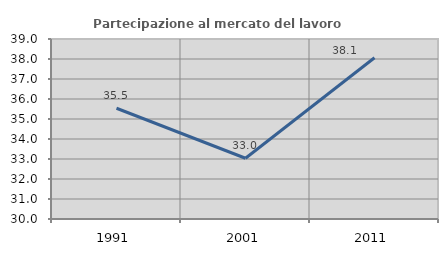
| Category | Partecipazione al mercato del lavoro  femminile |
|---|---|
| 1991.0 | 35.537 |
| 2001.0 | 33.037 |
| 2011.0 | 38.061 |